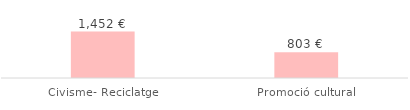
| Category | Total |
|---|---|
| Civisme- Reciclatge | 1452 |
| Promoció cultural | 802.5 |